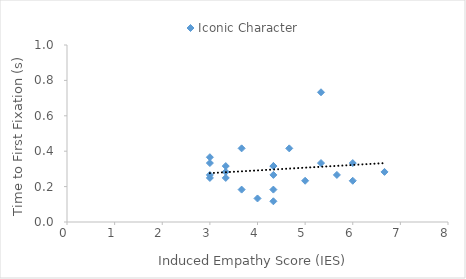
| Category | Iconic Character |
|---|---|
| 4.333333333333333 | 0.117 |
| 3.3333333333333335 | 0.316 |
| 5.333333333333333 | 0.733 |
| 6.0 | 0.333 |
| 4.333333333333333 | 0.183 |
| 6.0 | 0.233 |
| 5.333333333333333 | 0.333 |
| 4.0 | 0.133 |
| 5.666666666666667 | 0.266 |
| 6.666666666666667 | 0.283 |
| 4.333333333333333 | 0.316 |
| 5.0 | 0.233 |
| 3.0 | 0.249 |
| 4.333333333333333 | 0.316 |
| 4.333333333333333 | 0.266 |
| 3.3333333333333335 | 0.249 |
| 3.0 | 0.266 |
| 3.6666666666666665 | 0.416 |
| 3.3333333333333335 | 0.283 |
| 3.0 | 0.333 |
| 3.6666666666666665 | 0.183 |
| 3.0 | 0.366 |
| 4.666666666666667 | 0.416 |